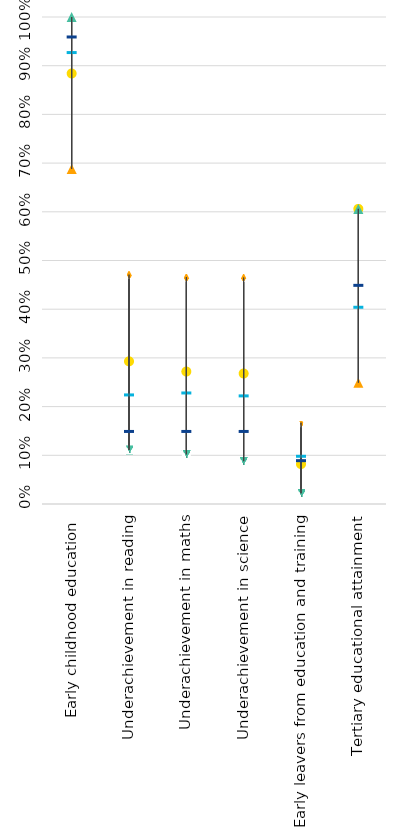
| Category | Luxembourg | Strongest performer | Weakest performer | EU average | EU target |
|---|---|---|---|---|---|
| Early childhood education  | 0.884 | 1 | 0.688 | 0.928 | 0.96 |
| Underachievement in reading | 0.293 | 0.111 | 0.471 | 0.225 | 0.15 |
| Underachievement in maths | 0.272 | 0.102 | 0.466 | 0.229 | 0.15 |
| Underachievement in science | 0.268 | 0.088 | 0.465 | 0.223 | 0.15 |
| Early leavers from education and training | 0.082 | 0.022 | 0.167 | 0.099 | 0.09 |
| Tertiary educational attainment | 0.606 | 0.606 | 0.249 | 0.405 | 0.45 |